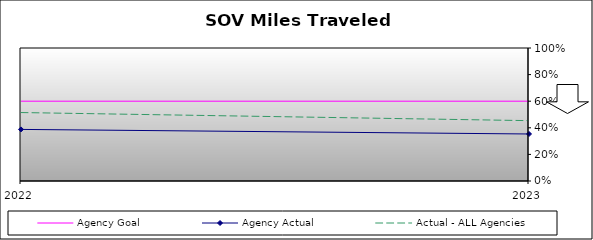
| Category | Agency Goal | Agency Actual | Actual - ALL Agencies |
|---|---|---|---|
| 2022.0 | 0.6 | 0.388 | 0.515 |
| 2023.0 | 0.6 | 0.354 | 0.454 |